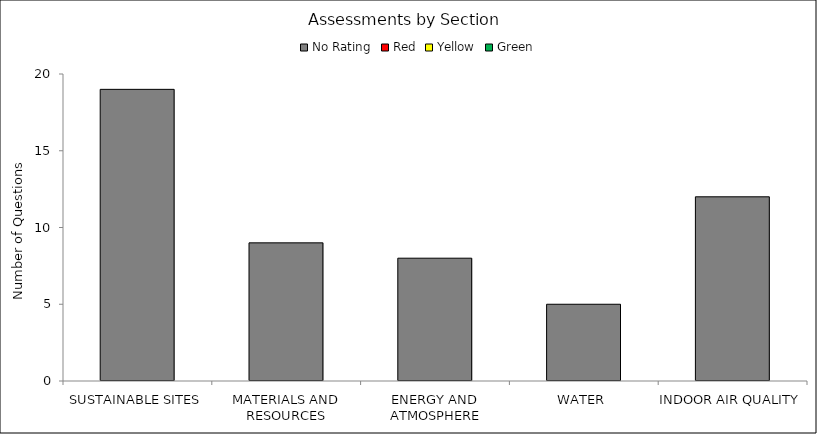
| Category | No Rating | Red | Yellow | Green |
|---|---|---|---|---|
| SUSTAINABLE SITES | 19 | 0 | 0 | 0 |
| MATERIALS AND RESOURCES | 9 | 0 | 0 | 0 |
| ENERGY AND ATMOSPHERE | 8 | 0 | 0 | 0 |
| WATER | 5 | 0 | 0 | 0 |
| INDOOR AIR QUALITY | 12 | 0 | 0 | 0 |